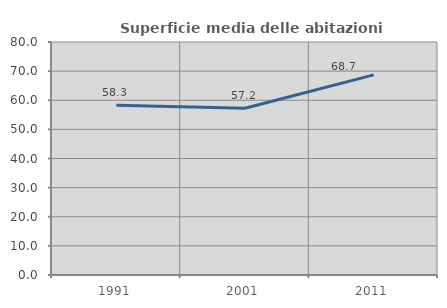
| Category | Superficie media delle abitazioni occupate |
|---|---|
| 1991.0 | 58.313 |
| 2001.0 | 57.247 |
| 2011.0 | 68.708 |